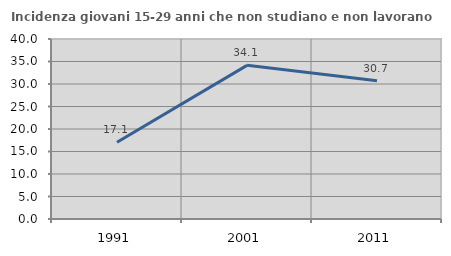
| Category | Incidenza giovani 15-29 anni che non studiano e non lavorano  |
|---|---|
| 1991.0 | 17.073 |
| 2001.0 | 34.146 |
| 2011.0 | 30.732 |